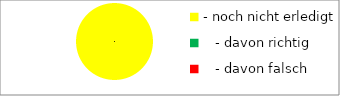
| Category | Series 0 |
|---|---|
| - noch nicht erledigt | 30 |
|    - davon richtig | 0 |
|    - davon falsch   | 0 |